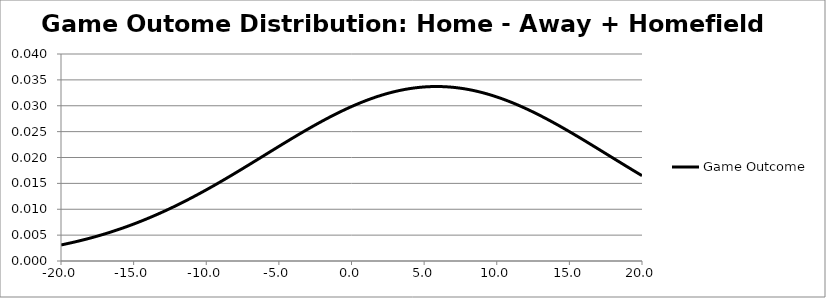
| Category | Game Outcome |
|---|---|
| -19.9999999999999 | 0.003 |
| -19.8999999999999 | 0.003 |
| -19.7999999999999 | 0.003 |
| -19.6999999999999 | 0.003 |
| -19.5999999999999 | 0.003 |
| -19.4999999999999 | 0.003 |
| -19.3999999999998 | 0.003 |
| -19.2999999999998 | 0.004 |
| -19.1999999999998 | 0.004 |
| -19.0999999999998 | 0.004 |
| -18.9999999999998 | 0.004 |
| -18.8999999999998 | 0.004 |
| -18.7999999999998 | 0.004 |
| -18.6999999999998 | 0.004 |
| -18.5999999999998 | 0.004 |
| -18.4999999999998 | 0.004 |
| -18.3999999999998 | 0.004 |
| -18.2999999999998 | 0.004 |
| -18.1999999999998 | 0.004 |
| -18.0999999999998 | 0.004 |
| -17.9999999999998 | 0.004 |
| -17.8999999999998 | 0.004 |
| -17.7999999999998 | 0.005 |
| -17.6999999999998 | 0.005 |
| -17.5999999999998 | 0.005 |
| -17.4999999999998 | 0.005 |
| -17.3999999999998 | 0.005 |
| -17.2999999999998 | 0.005 |
| -17.1999999999998 | 0.005 |
| -17.0999999999998 | 0.005 |
| -16.9999999999998 | 0.005 |
| -16.8999999999998 | 0.005 |
| -16.7999999999998 | 0.005 |
| -16.6999999999998 | 0.005 |
| -16.5999999999998 | 0.006 |
| -16.4999999999998 | 0.006 |
| -16.3999999999998 | 0.006 |
| -16.2999999999998 | 0.006 |
| -16.1999999999998 | 0.006 |
| -16.0999999999998 | 0.006 |
| -15.9999999999998 | 0.006 |
| -15.8999999999998 | 0.006 |
| -15.7999999999998 | 0.006 |
| -15.6999999999998 | 0.006 |
| -15.5999999999998 | 0.007 |
| -15.4999999999998 | 0.007 |
| -15.3999999999998 | 0.007 |
| -15.2999999999998 | 0.007 |
| -15.1999999999998 | 0.007 |
| -15.0999999999998 | 0.007 |
| -14.9999999999998 | 0.007 |
| -14.8999999999998 | 0.007 |
| -14.7999999999998 | 0.007 |
| -14.6999999999998 | 0.007 |
| -14.5999999999998 | 0.008 |
| -14.4999999999998 | 0.008 |
| -14.3999999999998 | 0.008 |
| -14.2999999999998 | 0.008 |
| -14.1999999999998 | 0.008 |
| -14.0999999999998 | 0.008 |
| -13.9999999999998 | 0.008 |
| -13.8999999999998 | 0.008 |
| -13.7999999999998 | 0.008 |
| -13.6999999999998 | 0.009 |
| -13.5999999999998 | 0.009 |
| -13.4999999999998 | 0.009 |
| -13.3999999999998 | 0.009 |
| -13.2999999999998 | 0.009 |
| -13.1999999999998 | 0.009 |
| -13.0999999999998 | 0.009 |
| -12.9999999999998 | 0.009 |
| -12.8999999999998 | 0.01 |
| -12.7999999999998 | 0.01 |
| -12.6999999999998 | 0.01 |
| -12.5999999999998 | 0.01 |
| -12.4999999999998 | 0.01 |
| -12.3999999999997 | 0.01 |
| -12.2999999999997 | 0.01 |
| -12.1999999999997 | 0.011 |
| -12.0999999999997 | 0.011 |
| -11.9999999999997 | 0.011 |
| -11.8999999999997 | 0.011 |
| -11.7999999999997 | 0.011 |
| -11.6999999999997 | 0.011 |
| -11.5999999999997 | 0.011 |
| -11.4999999999997 | 0.012 |
| -11.3999999999997 | 0.012 |
| -11.2999999999997 | 0.012 |
| -11.1999999999997 | 0.012 |
| -11.0999999999997 | 0.012 |
| -10.9999999999997 | 0.012 |
| -10.8999999999997 | 0.012 |
| -10.7999999999997 | 0.013 |
| -10.6999999999997 | 0.013 |
| -10.5999999999997 | 0.013 |
| -10.4999999999997 | 0.013 |
| -10.3999999999997 | 0.013 |
| -10.2999999999997 | 0.013 |
| -10.1999999999997 | 0.013 |
| -10.0999999999997 | 0.014 |
| -9.9999999999997 | 0.014 |
| -9.8999999999997 | 0.014 |
| -9.7999999999997 | 0.014 |
| -9.6999999999997 | 0.014 |
| -9.5999999999997 | 0.014 |
| -9.4999999999997 | 0.015 |
| -9.3999999999997 | 0.015 |
| -9.2999999999997 | 0.015 |
| -9.1999999999997 | 0.015 |
| -9.0999999999997 | 0.015 |
| -8.9999999999997 | 0.015 |
| -8.8999999999997 | 0.016 |
| -8.7999999999997 | 0.016 |
| -8.6999999999997 | 0.016 |
| -8.5999999999997 | 0.016 |
| -8.4999999999997 | 0.016 |
| -8.3999999999997 | 0.016 |
| -8.2999999999997 | 0.016 |
| -8.1999999999997 | 0.017 |
| -8.0999999999997 | 0.017 |
| -7.9999999999997 | 0.017 |
| -7.8999999999997 | 0.017 |
| -7.7999999999997 | 0.017 |
| -7.6999999999997 | 0.018 |
| -7.5999999999997 | 0.018 |
| -7.4999999999997 | 0.018 |
| -7.3999999999997 | 0.018 |
| -7.2999999999997 | 0.018 |
| -7.1999999999997 | 0.018 |
| -7.0999999999997 | 0.019 |
| -6.9999999999997 | 0.019 |
| -6.8999999999997 | 0.019 |
| -6.7999999999997 | 0.019 |
| -6.6999999999997 | 0.019 |
| -6.5999999999997 | 0.019 |
| -6.4999999999997 | 0.02 |
| -6.3999999999997 | 0.02 |
| -6.2999999999997 | 0.02 |
| -6.1999999999997 | 0.02 |
| -6.0999999999997 | 0.02 |
| -5.9999999999997 | 0.02 |
| -5.8999999999997 | 0.021 |
| -5.7999999999997 | 0.021 |
| -5.6999999999997 | 0.021 |
| -5.5999999999997 | 0.021 |
| -5.4999999999997 | 0.021 |
| -5.3999999999997 | 0.021 |
| -5.2999999999996 | 0.022 |
| -5.1999999999996 | 0.022 |
| -5.0999999999996 | 0.022 |
| -4.9999999999996 | 0.022 |
| -4.8999999999996 | 0.022 |
| -4.7999999999996 | 0.022 |
| -4.6999999999996 | 0.023 |
| -4.5999999999996 | 0.023 |
| -4.4999999999996 | 0.023 |
| -4.3999999999996 | 0.023 |
| -4.2999999999996 | 0.023 |
| -4.1999999999996 | 0.024 |
| -4.0999999999996 | 0.024 |
| -3.9999999999996 | 0.024 |
| -3.8999999999996 | 0.024 |
| -3.7999999999996 | 0.024 |
| -3.6999999999996 | 0.024 |
| -3.5999999999996 | 0.025 |
| -3.4999999999996 | 0.025 |
| -3.3999999999996 | 0.025 |
| -3.2999999999996 | 0.025 |
| -3.1999999999996 | 0.025 |
| -3.0999999999996 | 0.025 |
| -2.9999999999996 | 0.025 |
| -2.8999999999996 | 0.026 |
| -2.7999999999996 | 0.026 |
| -2.6999999999996 | 0.026 |
| -2.5999999999996 | 0.026 |
| -2.4999999999996 | 0.026 |
| -2.3999999999996 | 0.026 |
| -2.2999999999996 | 0.027 |
| -2.1999999999996 | 0.027 |
| -2.0999999999996 | 0.027 |
| -1.9999999999996 | 0.027 |
| -1.8999999999996 | 0.027 |
| -1.7999999999996 | 0.027 |
| -1.6999999999996 | 0.028 |
| -1.5999999999996 | 0.028 |
| -1.4999999999996 | 0.028 |
| -1.3999999999996 | 0.028 |
| -1.2999999999996 | 0.028 |
| -1.1999999999996 | 0.028 |
| -1.0999999999996 | 0.028 |
| -0.999999999999599 | 0.029 |
| -0.899999999999601 | 0.029 |
| -0.799999999999599 | 0.029 |
| -0.699999999999601 | 0.029 |
| -0.5999999999996 | 0.029 |
| -0.499999999999599 | 0.029 |
| -0.399999999999601 | 0.029 |
| -0.299999999999599 | 0.029 |
| -0.199999999999601 | 0.03 |
| -0.0999999999996 | 0.03 |
| 4.01456645704457e-13 | 0.03 |
| 0.100000000000399 | 0.03 |
| 0.200000000000401 | 0.03 |
| 0.300000000000399 | 0.03 |
| 0.4000000000004 | 0.03 |
| 0.500000000000401 | 0.03 |
| 0.600000000000399 | 0.031 |
| 0.700000000000401 | 0.031 |
| 0.800000000000399 | 0.031 |
| 0.9000000000004 | 0.031 |
| 1.0000000000004 | 0.031 |
| 1.1000000000004 | 0.031 |
| 1.2000000000004 | 0.031 |
| 1.3000000000004 | 0.031 |
| 1.4000000000004 | 0.031 |
| 1.5000000000004 | 0.032 |
| 1.6000000000004 | 0.032 |
| 1.7000000000005 | 0.032 |
| 1.8000000000005 | 0.032 |
| 1.9000000000005 | 0.032 |
| 2.0000000000005 | 0.032 |
| 2.1000000000005 | 0.032 |
| 2.2000000000005002 | 0.032 |
| 2.3000000000005 | 0.032 |
| 2.4000000000005 | 0.032 |
| 2.5000000000005 | 0.032 |
| 2.6000000000005 | 0.032 |
| 2.7000000000005 | 0.033 |
| 2.8000000000005 | 0.033 |
| 2.9000000000005 | 0.033 |
| 3.0000000000005 | 0.033 |
| 3.1000000000005 | 0.033 |
| 3.2000000000005 | 0.033 |
| 3.3000000000005 | 0.033 |
| 3.4000000000005 | 0.033 |
| 3.5000000000005 | 0.033 |
| 3.6000000000005 | 0.033 |
| 3.7000000000005 | 0.033 |
| 3.8000000000005 | 0.033 |
| 3.9000000000005 | 0.033 |
| 4.0000000000005 | 0.033 |
| 4.1000000000005 | 0.033 |
| 4.2000000000005 | 0.033 |
| 4.3000000000005 | 0.033 |
| 4.4000000000005 | 0.033 |
| 4.5000000000005 | 0.033 |
| 4.6000000000005 | 0.034 |
| 4.7000000000005 | 0.034 |
| 4.8000000000005 | 0.034 |
| 4.9000000000005 | 0.034 |
| 5.0000000000005 | 0.034 |
| 5.1000000000005 | 0.034 |
| 5.2000000000005 | 0.034 |
| 5.3000000000005 | 0.034 |
| 5.4000000000005 | 0.034 |
| 5.5000000000005 | 0.034 |
| 5.6000000000005 | 0.034 |
| 5.7000000000005 | 0.034 |
| 5.8000000000005 | 0.034 |
| 5.9000000000005 | 0.034 |
| 6.0000000000005 | 0.034 |
| 6.1000000000005 | 0.034 |
| 6.2000000000005 | 0.034 |
| 6.3000000000005 | 0.034 |
| 6.4000000000005 | 0.034 |
| 6.5000000000005 | 0.034 |
| 6.6000000000005 | 0.034 |
| 6.7000000000005 | 0.034 |
| 6.8000000000005 | 0.034 |
| 6.9000000000005 | 0.034 |
| 7.0000000000005 | 0.034 |
| 7.1000000000005 | 0.034 |
| 7.2000000000005 | 0.033 |
| 7.3000000000005 | 0.033 |
| 7.4000000000005 | 0.033 |
| 7.5000000000005 | 0.033 |
| 7.6000000000005 | 0.033 |
| 7.7000000000005 | 0.033 |
| 7.8000000000005 | 0.033 |
| 7.9000000000005 | 0.033 |
| 8.0000000000005 | 0.033 |
| 8.1000000000005 | 0.033 |
| 8.2000000000005 | 0.033 |
| 8.3000000000005 | 0.033 |
| 8.4000000000005 | 0.033 |
| 8.5000000000005 | 0.033 |
| 8.6000000000005 | 0.033 |
| 8.7000000000005 | 0.033 |
| 8.8000000000006 | 0.033 |
| 8.9000000000006 | 0.033 |
| 9.0000000000006 | 0.033 |
| 9.1000000000006 | 0.032 |
| 9.2000000000006 | 0.032 |
| 9.3000000000006 | 0.032 |
| 9.4000000000006 | 0.032 |
| 9.5000000000006 | 0.032 |
| 9.6000000000006 | 0.032 |
| 9.7000000000006 | 0.032 |
| 9.8000000000006 | 0.032 |
| 9.9000000000006 | 0.032 |
| 10.0000000000006 | 0.032 |
| 10.1000000000006 | 0.032 |
| 10.2000000000006 | 0.032 |
| 10.3000000000006 | 0.031 |
| 10.4000000000006 | 0.031 |
| 10.5000000000006 | 0.031 |
| 10.6000000000006 | 0.031 |
| 10.7000000000006 | 0.031 |
| 10.8000000000006 | 0.031 |
| 10.9000000000006 | 0.031 |
| 11.0000000000006 | 0.031 |
| 11.1000000000006 | 0.031 |
| 11.2000000000006 | 0.03 |
| 11.3000000000006 | 0.03 |
| 11.4000000000006 | 0.03 |
| 11.5000000000006 | 0.03 |
| 11.6000000000006 | 0.03 |
| 11.7000000000006 | 0.03 |
| 11.8000000000006 | 0.03 |
| 11.9000000000006 | 0.03 |
| 12.0000000000006 | 0.029 |
| 12.1000000000006 | 0.029 |
| 12.2000000000006 | 0.029 |
| 12.3000000000006 | 0.029 |
| 12.4000000000006 | 0.029 |
| 12.5000000000006 | 0.029 |
| 12.6000000000006 | 0.029 |
| 12.7000000000006 | 0.029 |
| 12.8000000000006 | 0.028 |
| 12.9000000000006 | 0.028 |
| 13.0000000000006 | 0.028 |
| 13.1000000000006 | 0.028 |
| 13.2000000000006 | 0.028 |
| 13.3000000000006 | 0.028 |
| 13.4000000000006 | 0.028 |
| 13.5000000000006 | 0.027 |
| 13.6000000000006 | 0.027 |
| 13.7000000000006 | 0.027 |
| 13.8000000000006 | 0.027 |
| 13.9000000000006 | 0.027 |
| 14.0000000000006 | 0.027 |
| 14.1000000000006 | 0.026 |
| 14.2000000000006 | 0.026 |
| 14.3000000000006 | 0.026 |
| 14.4000000000006 | 0.026 |
| 14.5000000000006 | 0.026 |
| 14.6000000000006 | 0.026 |
| 14.7000000000006 | 0.025 |
| 14.8000000000006 | 0.025 |
| 14.9000000000006 | 0.025 |
| 15.0000000000006 | 0.025 |
| 15.1000000000006 | 0.025 |
| 15.2000000000006 | 0.025 |
| 15.3000000000006 | 0.025 |
| 15.4000000000006 | 0.024 |
| 15.5000000000006 | 0.024 |
| 15.6000000000006 | 0.024 |
| 15.7000000000006 | 0.024 |
| 15.8000000000007 | 0.024 |
| 15.9000000000007 | 0.024 |
| 16.0000000000007 | 0.023 |
| 16.1000000000007 | 0.023 |
| 16.2000000000007 | 0.023 |
| 16.3000000000007 | 0.023 |
| 16.4000000000007 | 0.023 |
| 16.5000000000007 | 0.022 |
| 16.6000000000007 | 0.022 |
| 16.7000000000007 | 0.022 |
| 16.8000000000007 | 0.022 |
| 16.9000000000007 | 0.022 |
| 17.0000000000007 | 0.022 |
| 17.1000000000007 | 0.021 |
| 17.2000000000007 | 0.021 |
| 17.3000000000007 | 0.021 |
| 17.4000000000007 | 0.021 |
| 17.5000000000007 | 0.021 |
| 17.6000000000007 | 0.021 |
| 17.7000000000007 | 0.02 |
| 17.8000000000007 | 0.02 |
| 17.9000000000007 | 0.02 |
| 18.0000000000007 | 0.02 |
| 18.1000000000007 | 0.02 |
| 18.2000000000007 | 0.02 |
| 18.3000000000007 | 0.019 |
| 18.4000000000007 | 0.019 |
| 18.5000000000007 | 0.019 |
| 18.6000000000007 | 0.019 |
| 18.7000000000007 | 0.019 |
| 18.8000000000007 | 0.019 |
| 18.9000000000007 | 0.018 |
| 19.0000000000007 | 0.018 |
| 19.1000000000007 | 0.018 |
| 19.2000000000007 | 0.018 |
| 19.3000000000007 | 0.018 |
| 19.4000000000007 | 0.018 |
| 19.5000000000007 | 0.017 |
| 19.6000000000007 | 0.017 |
| 19.7000000000007 | 0.017 |
| 19.8000000000007 | 0.017 |
| 19.9000000000007 | 0.017 |
| 20.0000000000007 | 0.016 |